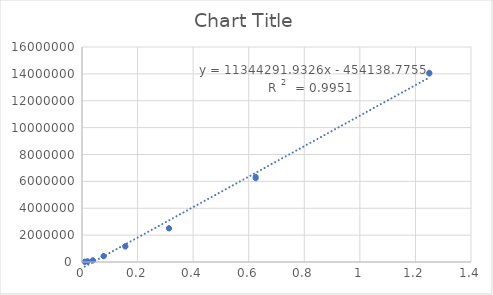
| Category | Series 0 |
|---|---|
| 0.01 | 15721 |
| 0.01 | 20049 |
| 0.02 | 52341 |
| 0.02 | 30298 |
| 0.039 | 115570 |
| 0.039 | 121883 |
| 0.078 | 426787 |
| 0.078 | 441470 |
| 0.156 | 1146851 |
| 0.156 | 1174678 |
| 0.313 | 2509139 |
| 0.313 | 2509960 |
| 0.625 | 6228004 |
| 0.625 | 6348094 |
| 1.25 | 14089493 |
| 1.25 | 14020704 |